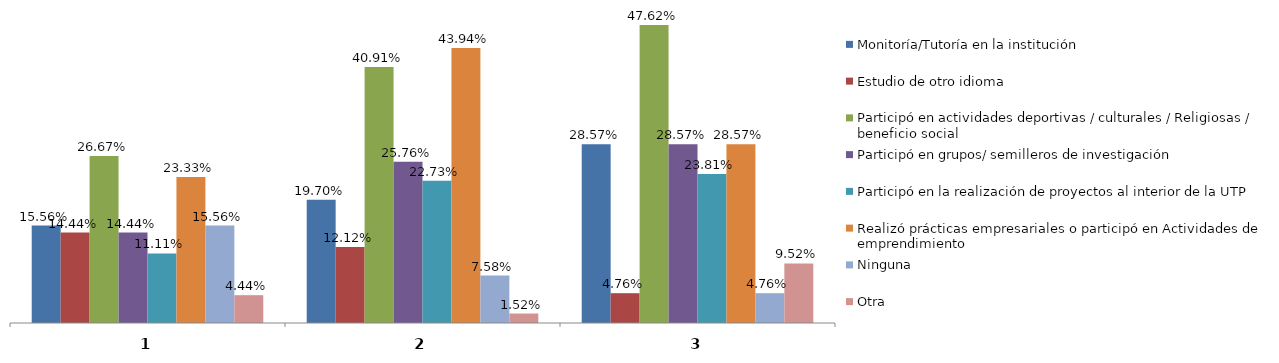
| Category | Monitoría/Tutoría en la institución | Estudio de otro idioma | Participó en actividades deportivas / culturales / Religiosas / beneficio social | Participó en grupos/ semilleros de investigación | Participó en la realización de proyectos al interior de la UTP | Realizó prácticas empresariales o participó en Actividades de emprendimiento | Ninguna | Otra |
|---|---|---|---|---|---|---|---|---|
| 0 | 0.156 | 0.144 | 0.267 | 0.144 | 0.111 | 0.233 | 0.156 | 0.044 |
| 1 | 0.197 | 0.121 | 0.409 | 0.258 | 0.227 | 0.439 | 0.076 | 0.015 |
| 2 | 0.286 | 0.048 | 0.476 | 0.286 | 0.238 | 0.286 | 0.048 | 0.095 |